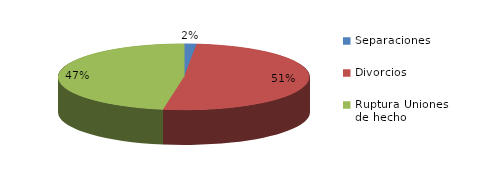
| Category | Series 0 |
|---|---|
| Separaciones | 24 |
| Divorcios | 780 |
| Ruptura Uniones de hecho | 723 |